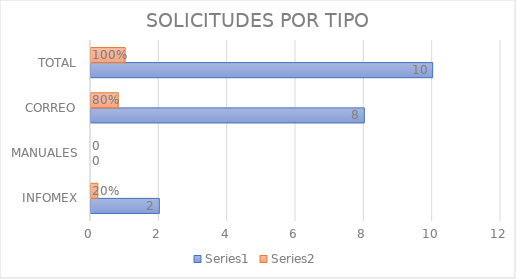
| Category | Series 0 | Series 1 |
|---|---|---|
| INFOMEX | 2 | 0.2 |
| MANUALES | 0 | 0 |
| CORREO | 8 | 0.8 |
| TOTAL | 10 | 1 |